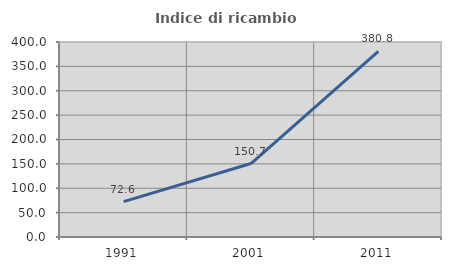
| Category | Indice di ricambio occupazionale  |
|---|---|
| 1991.0 | 72.642 |
| 2001.0 | 150.746 |
| 2011.0 | 380.769 |